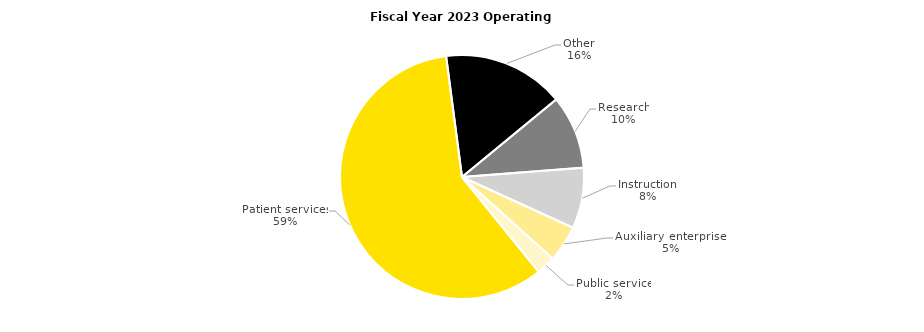
| Category | Series 0 |
|---|---|
| Patient services | 2697.596 |
| Other | 739.881 |
| Research | 447.471 |
| Instruction | 369.06 |
| Auxiliary enterprises | 222.557 |
| Public service | 114.819 |